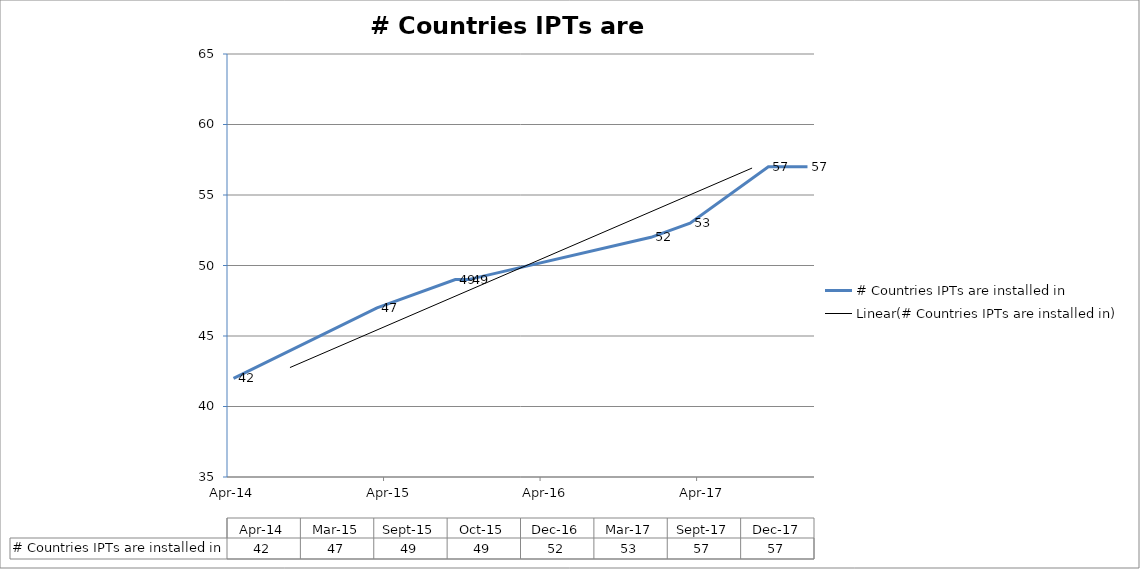
| Category | # Countries IPTs are installed in |
|---|---|
| 2014-04-01 | 42 |
| 2015-03-01 | 47 |
| 2015-09-01 | 49 |
| 2015-10-16 | 49 |
| 2016-12-01 | 52 |
| 2017-03-01 | 53 |
| 2017-09-20 | 57 |
| 2017-12-04 | 57 |